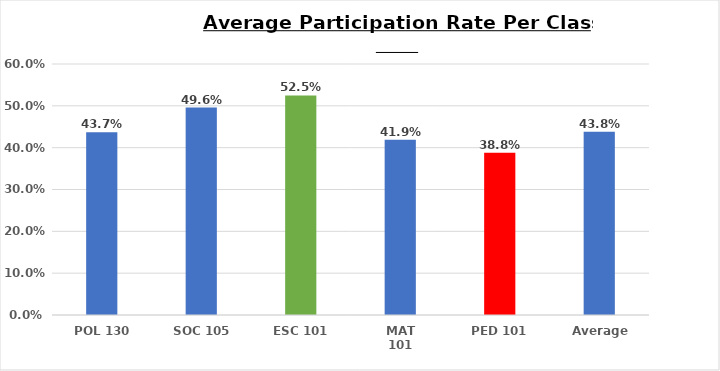
| Category | Average Paticipation  |
|---|---|
| POL 130 | 0.437 |
| SOC 105 | 0.496 |
| ESC 101 | 0.525 |
| MAT 101 | 0.419 |
| PED 101 | 0.388 |
| Average | 0.438 |